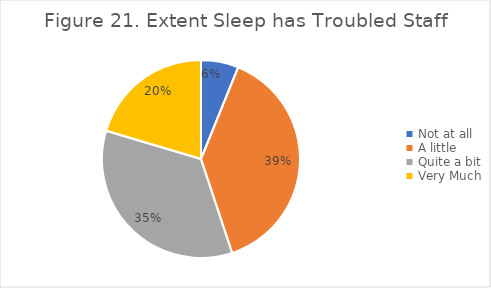
| Category | Series 0 |
|---|---|
| Not at all | 0.061 |
| A little | 0.388 |
| Quite a bit | 0.347 |
| Very Much | 0.204 |